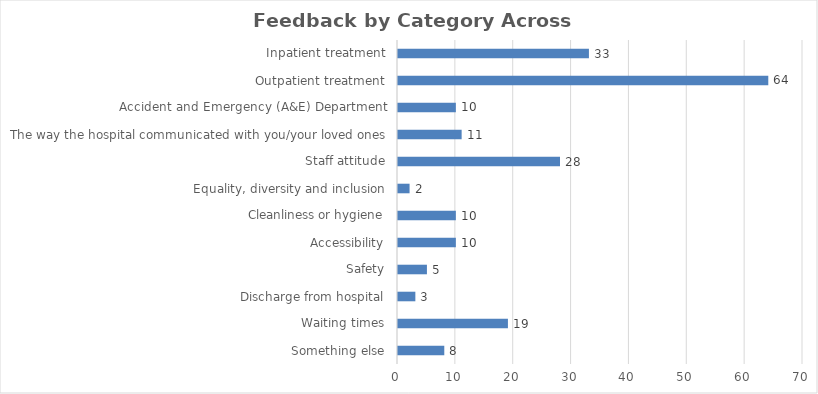
| Category | Series 0 |
|---|---|
| Something else | 8 |
| Waiting times | 19 |
| Discharge from hospital | 3 |
| Safety | 5 |
| Accessibility | 10 |
| Cleanliness or hygiene | 10 |
| Equality, diversity and inclusion | 2 |
| Staff attitude | 28 |
| The way the hospital communicated with you/your loved ones | 11 |
| Accident and Emergency (A&E) Department | 10 |
| Outpatient treatment | 64 |
| Inpatient treatment | 33 |